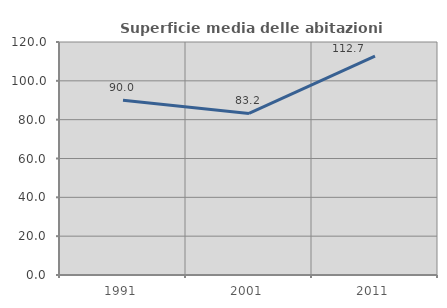
| Category | Superficie media delle abitazioni occupate |
|---|---|
| 1991.0 | 90.035 |
| 2001.0 | 83.216 |
| 2011.0 | 112.703 |